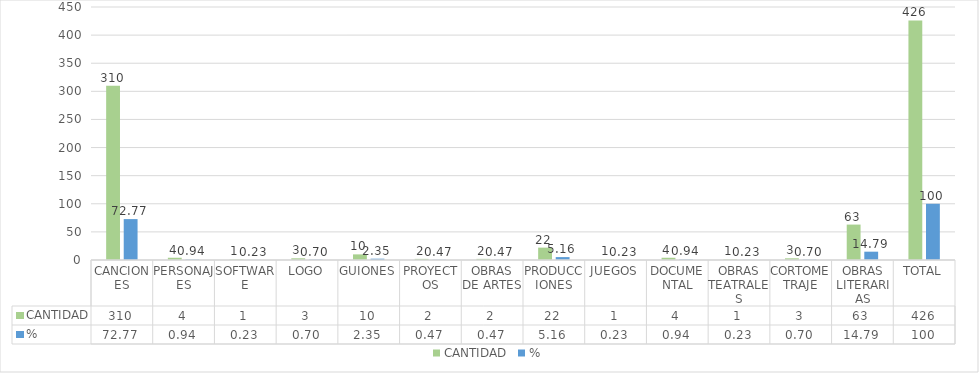
| Category | CANTIDAD | % |
|---|---|---|
| CANCIONES | 310 | 72.77 |
| PERSONAJES | 4 | 0.939 |
| SOFTWARE | 1 | 0.235 |
| LOGO | 3 | 0.704 |
| GUIONES | 10 | 2.347 |
| PROYECTOS | 2 | 0.469 |
| OBRAS DE ARTES | 2 | 0.469 |
| PRODUCCIONES | 22 | 5.164 |
| JUEGOS | 1 | 0.235 |
| DOCUMENTAL | 4 | 0.939 |
| OBRAS TEATRALES | 1 | 0.235 |
| CORTOMETRAJE | 3 | 0.704 |
| OBRAS LITERARIAS | 63 | 14.789 |
| TOTAL | 426 | 100 |